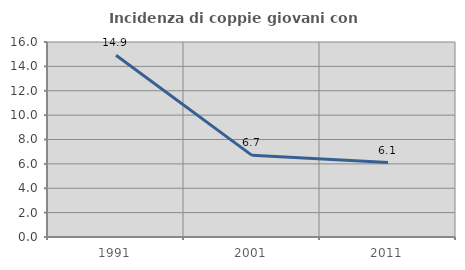
| Category | Incidenza di coppie giovani con figli |
|---|---|
| 1991.0 | 14.912 |
| 2001.0 | 6.699 |
| 2011.0 | 6.111 |